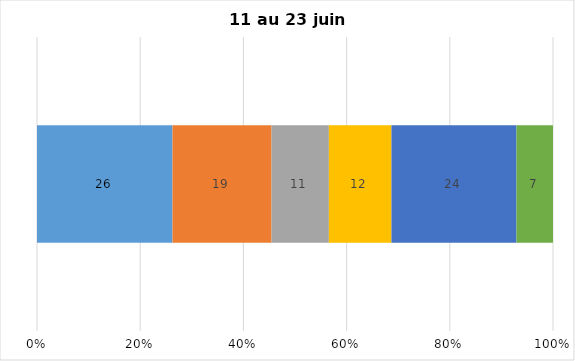
| Category | Plusieurs fois par jour | Une fois par jour | Quelques fois par semaine   | Une fois par semaine ou moins   |  Jamais   |  Je n’utilise pas les médias sociaux |
|---|---|---|---|---|---|---|
| 0 | 26 | 19 | 11 | 12 | 24 | 7 |